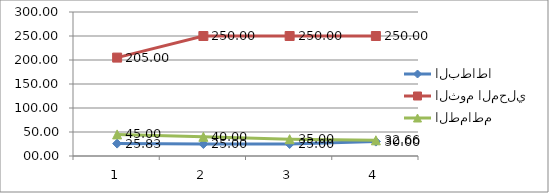
| Category | البطاطا | الثوم المحلي | الطماطم |
|---|---|---|---|
| 0 | 25.83 | 205 | 45 |
| 1 | 25 | 250 | 40 |
| 2 | 25 | 250 | 35 |
| 3 | 30 | 250 | 32.66 |